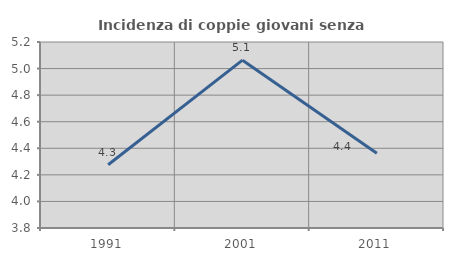
| Category | Incidenza di coppie giovani senza figli |
|---|---|
| 1991.0 | 4.276 |
| 2001.0 | 5.063 |
| 2011.0 | 4.362 |